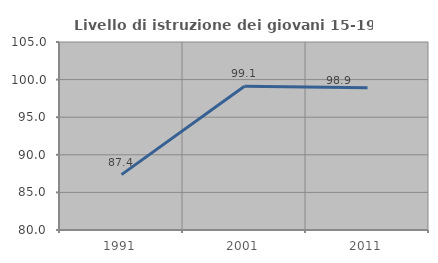
| Category | Livello di istruzione dei giovani 15-19 anni |
|---|---|
| 1991.0 | 87.363 |
| 2001.0 | 99.115 |
| 2011.0 | 98.913 |